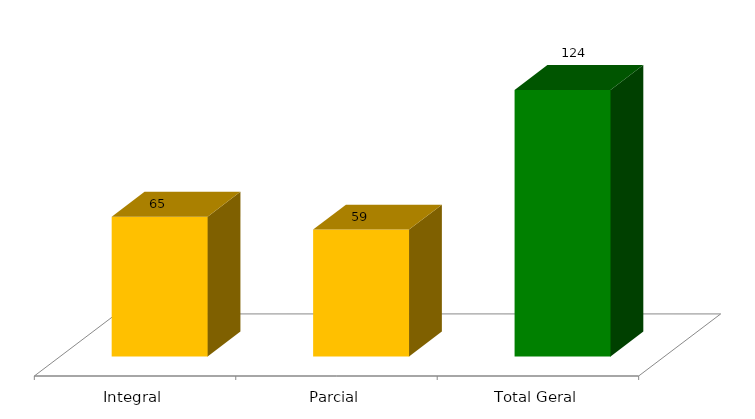
| Category | Categoria/Ano |
|---|---|
| Integral | 65 |
| Parcial | 59 |
| Total Geral | 124 |